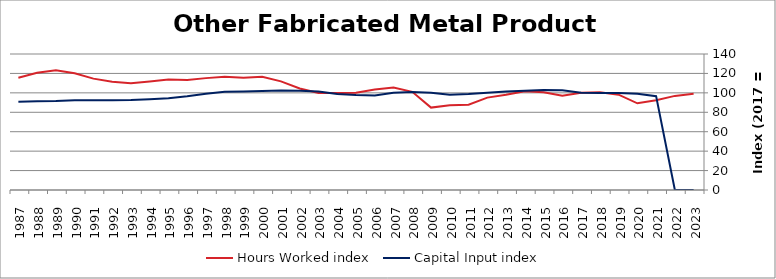
| Category | Hours Worked index | Capital Input index |
|---|---|---|
| 2023.0 | 98.99 | 0 |
| 2022.0 | 96.881 | 0 |
| 2021.0 | 92.442 | 96.595 |
| 2020.0 | 89.227 | 99.067 |
| 2019.0 | 98.165 | 99.756 |
| 2018.0 | 100.579 | 99.879 |
| 2017.0 | 100 | 100 |
| 2016.0 | 97.146 | 102.56 |
| 2015.0 | 100.666 | 102.935 |
| 2014.0 | 101.569 | 102.228 |
| 2013.0 | 98.024 | 101.498 |
| 2012.0 | 95.111 | 100.012 |
| 2011.0 | 87.85 | 98.748 |
| 2010.0 | 87.249 | 98.016 |
| 2009.0 | 84.822 | 100.071 |
| 2008.0 | 101.067 | 100.824 |
| 2007.0 | 105.442 | 100.024 |
| 2006.0 | 103.46 | 97.391 |
| 2005.0 | 100.217 | 97.757 |
| 2004.0 | 99.867 | 98.808 |
| 2003.0 | 99.965 | 101.409 |
| 2002.0 | 104.461 | 102.27 |
| 2001.0 | 111.805 | 102.299 |
| 2000.0 | 116.601 | 101.89 |
| 1999.0 | 115.6 | 101.375 |
| 1998.0 | 116.691 | 101.201 |
| 1997.0 | 115.167 | 99.031 |
| 1996.0 | 113.24 | 96.449 |
| 1995.0 | 113.789 | 94.438 |
| 1994.0 | 111.774 | 93.403 |
| 1993.0 | 109.988 | 92.534 |
| 1992.0 | 111.469 | 92.432 |
| 1991.0 | 114.644 | 92.335 |
| 1990.0 | 120.15 | 92.429 |
| 1989.0 | 123.182 | 91.593 |
| 1988.0 | 120.594 | 91.412 |
| 1987.0 | 115.492 | 90.957 |